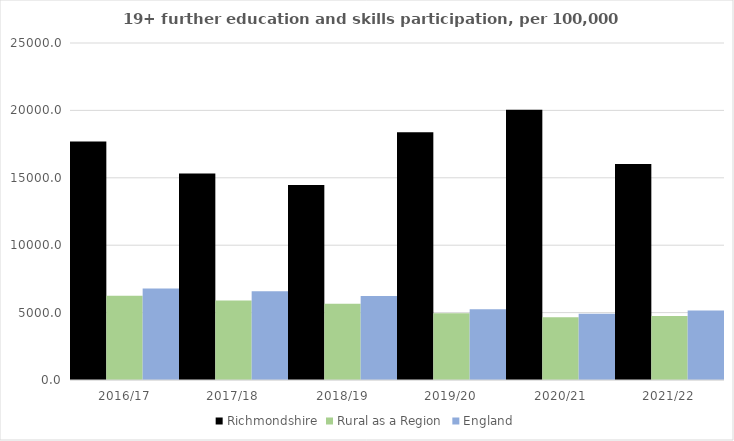
| Category | Richmondshire | Rural as a Region | England |
|---|---|---|---|
| 2016/17 | 17692 | 6253.401 | 6788 |
| 2017/18 | 15319 | 5892.029 | 6588 |
| 2018/19 | 14457 | 5661.873 | 6227 |
| 2019/20 | 18381 | 4943.801 | 5244 |
| 2020/21 | 20041 | 4646.727 | 4913 |
| 2021/22 | 16022 | 4747.049 | 5151 |